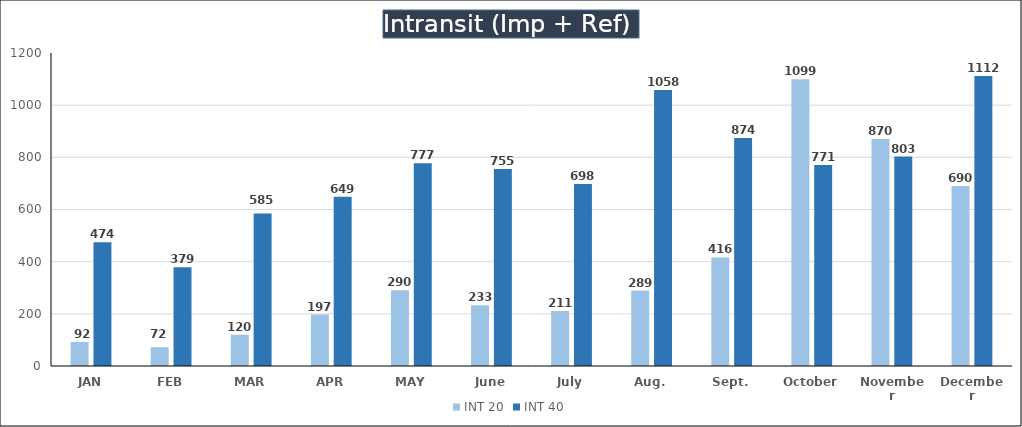
| Category | INT 20 | INT 40 |
|---|---|---|
| JAN | 92 | 474 |
| FEB | 72 | 379 |
| MAR | 120 | 585 |
| APR | 197 | 649 |
| MAY | 290 | 777 |
| June | 233 | 755 |
| July | 211 | 698 |
| Aug. | 289 | 1058 |
| Sept. | 416 | 874 |
| October | 1099 | 771 |
| November | 870 | 803 |
| December | 690 | 1112 |